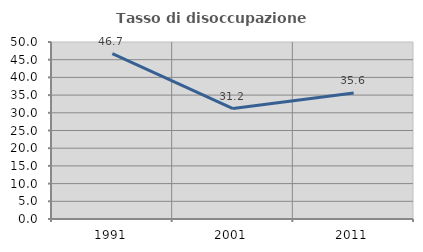
| Category | Tasso di disoccupazione giovanile  |
|---|---|
| 1991.0 | 46.737 |
| 2001.0 | 31.19 |
| 2011.0 | 35.587 |